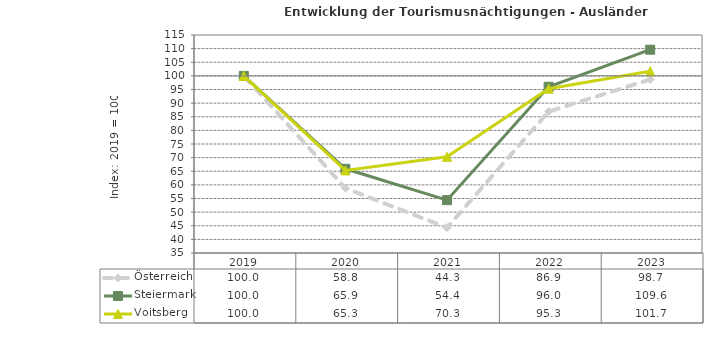
| Category | Österreich | Steiermark | Voitsberg |
|---|---|---|---|
| 2023.0 | 98.7 | 109.6 | 101.7 |
| 2022.0 | 86.9 | 96 | 95.3 |
| 2021.0 | 44.3 | 54.4 | 70.3 |
| 2020.0 | 58.8 | 65.9 | 65.3 |
| 2019.0 | 100 | 100 | 100 |